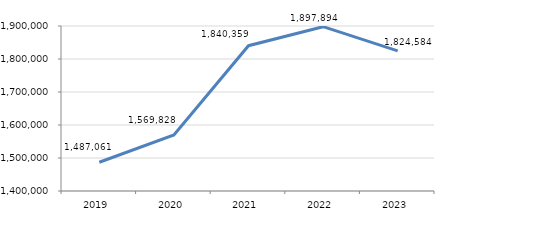
| Category | Series 0 |
|---|---|
| 2019.0 | 1487061.28 |
| 2020.0 | 1569828.12 |
| 2021.0 | 1840359.08 |
| 2022.0 | 1897893.61 |
| 2023.0 | 1824583.63 |